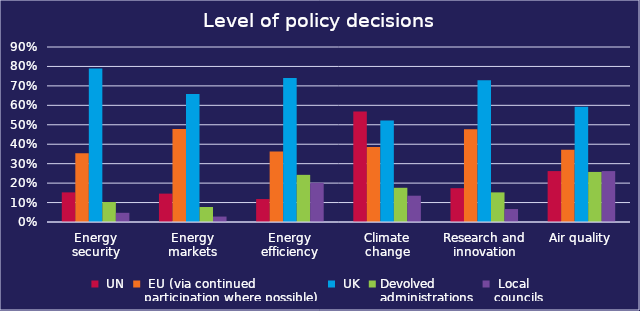
| Category |  UN |  EU (via continued 
participation where possible) |  UK | Devolved 
administrations |  Local 
councils |
|---|---|---|---|---|---|
| Energy security | 0.152 | 0.354 | 0.79 | 0.103 | 0.047 |
| Energy markets | 0.146 | 0.479 | 0.659 | 0.077 | 0.028 |
| Energy efficiency | 0.118 | 0.363 | 0.74 | 0.242 | 0.202 |
| Climate change | 0.569 | 0.386 | 0.521 | 0.176 | 0.135 |
| Research and innovation | 0.174 | 0.476 | 0.73 | 0.152 | 0.067 |
| Air quality | 0.262 | 0.371 | 0.592 | 0.258 | 0.262 |